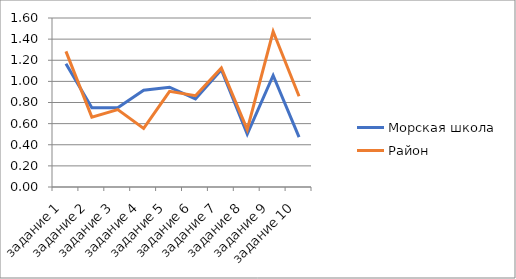
| Category | Морская школа | Район |
|---|---|---|
| задание 1 | 1.167 | 1.284 |
| задание 2 | 0.75 | 0.661 |
| задание 3 | 0.75 | 0.733 |
| задание 4 | 0.917 | 0.555 |
| задание 5 | 0.944 | 0.906 |
| задание 6 | 0.833 | 0.865 |
| задание 7 | 1.111 | 1.127 |
| задание 8 | 0.5 | 0.543 |
| задание 9 | 1.056 | 1.472 |
| задание 10 | 0.472 | 0.859 |